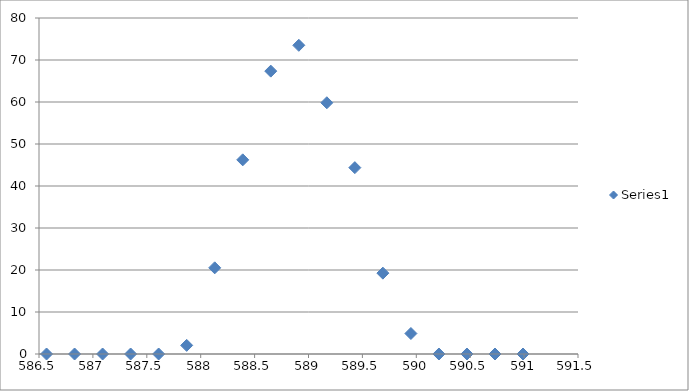
| Category | Series 0 |
|---|---|
| 586.57 | 0 |
| 586.83 | 0 |
| 587.09 | 0 |
| 587.35 | 0 |
| 587.61 | 0 |
| 587.87 | 2.05 |
| 588.13 | 20.52 |
| 588.39 | 46.23 |
| 588.65 | 67.35 |
| 588.91 | 73.5 |
| 589.17 | 59.82 |
| 589.43 | 44.37 |
| 589.69 | 19.25 |
| 589.95 | 4.88 |
| 590.21 | 0 |
| 590.47 | 0 |
| 590.73 | 0 |
| 590.99 | 0 |